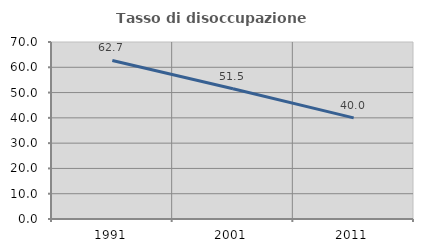
| Category | Tasso di disoccupazione giovanile  |
|---|---|
| 1991.0 | 62.687 |
| 2001.0 | 51.493 |
| 2011.0 | 40 |